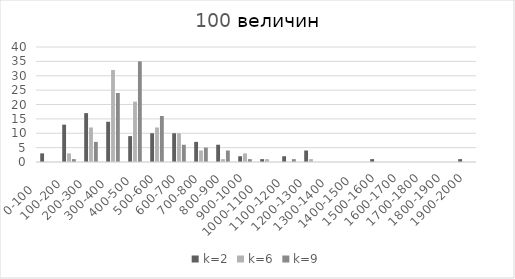
| Category | k=2 | k=6 | k=9 |
|---|---|---|---|
| 0-100     | 3 | 0 | 0 |
| 100-200   | 13 | 3 | 1 |
| 200-300   | 17 | 12 | 7 |
| 300-400   | 14 | 32 | 24 |
| 400-500  | 9 | 21 | 35 |
| 500-600 | 10 | 12 | 16 |
| 600-700 | 10 | 10 | 6 |
| 700-800 | 7 | 4 | 5 |
| 800-900 | 6 | 1 | 4 |
| 900-1000 | 2 | 3 | 1 |
| 1000-1100     | 1 | 1 | 0 |
| 1100-1200   | 2 | 0 | 1 |
| 1200-1300   | 4 | 1 | 0 |
| 1300-1400   | 0 | 0 | 0 |
| 1400-1500  | 0 | 0 | 0 |
| 1500-1600 | 1 | 0 | 0 |
| 1600-1700 | 0 | 0 | 0 |
| 1700-1800 | 0 | 0 | 0 |
| 1800-1900 | 0 | 0 | 0 |
| 1900-2000 | 1 | 0 | 0 |